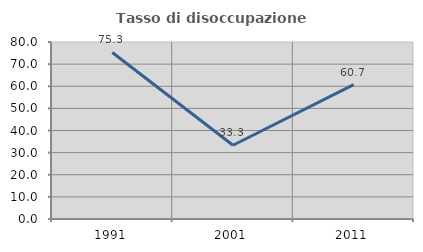
| Category | Tasso di disoccupazione giovanile  |
|---|---|
| 1991.0 | 75.281 |
| 2001.0 | 33.333 |
| 2011.0 | 60.714 |